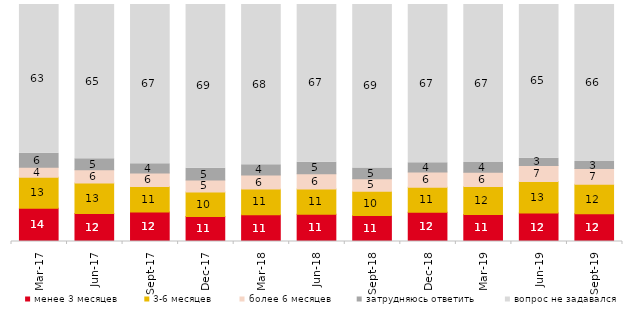
| Category | менее 3 месяцев | 3-6 месяцев | более 6 месяцев | затрудняюсь ответить | вопрос не задавался |
|---|---|---|---|---|---|
| 2017-03-01 | 14.05 | 13.05 | 4.25 | 5.85 | 62.8 |
| 2017-06-01 | 11.8 | 12.85 | 5.65 | 4.65 | 65.05 |
| 2017-09-01 | 12.45 | 10.75 | 5.7 | 3.9 | 67.2 |
| 2017-12-01 | 10.55 | 10.3 | 5.15 | 4.95 | 69.05 |
| 2018-03-01 | 11.3 | 10.8 | 6 | 4.25 | 67.65 |
| 2018-06-01 | 11.45 | 10.75 | 6.4 | 4.85 | 66.55 |
| 2018-09-01 | 10.95 | 10.3 | 5.2 | 4.55 | 69 |
| 2018-12-01 | 12.3 | 10.6 | 6.4 | 3.95 | 66.75 |
| 2019-03-01 | 11.437 | 11.735 | 6.067 | 4.078 | 66.683 |
| 2019-06-01 | 12.07 | 13.217 | 6.733 | 3.142 | 64.838 |
| 2019-09-01 | 11.683 | 12.426 | 6.683 | 2.921 | 66.287 |